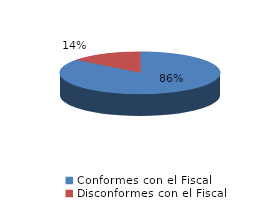
| Category | Series 0 |
|---|---|
| 0 | 89 |
| 1 | 15 |